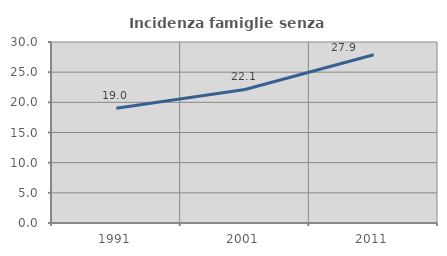
| Category | Incidenza famiglie senza nuclei |
|---|---|
| 1991.0 | 19.03 |
| 2001.0 | 22.138 |
| 2011.0 | 27.898 |